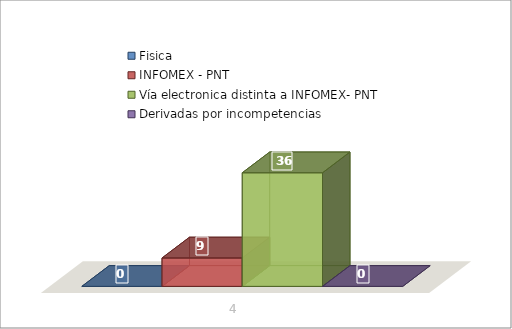
| Category | Fisica | INFOMEX - PNT | Vía electronica distinta a INFOMEX- PNT | Derivadas por incompetencias |
|---|---|---|---|---|
| 0 | 0 | 9 | 36 | 0 |